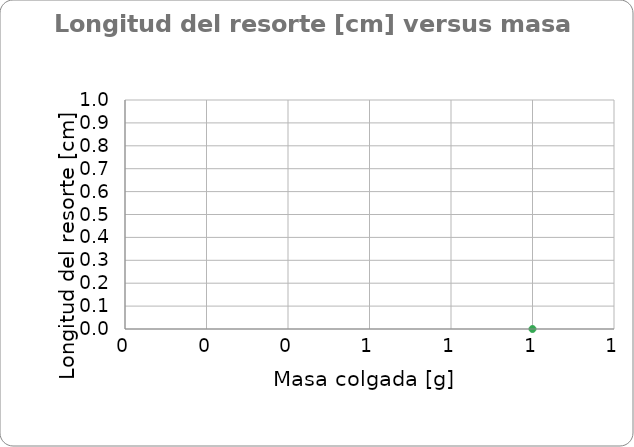
| Category | Datos |
|---|---|
| 0.0 | 0 |
| nan | 0 |
| nan | 0 |
| nan | 0 |
| nan | 0 |
| nan | 0 |
| nan | 0 |
| nan | 0 |
| nan | 0 |
| nan | 0 |